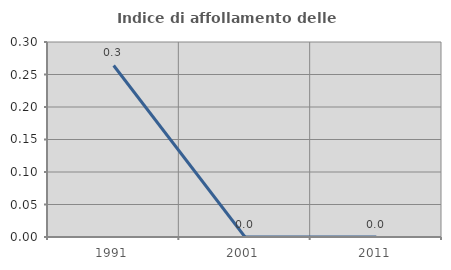
| Category | Indice di affollamento delle abitazioni  |
|---|---|
| 1991.0 | 0.264 |
| 2001.0 | 0 |
| 2011.0 | 0 |